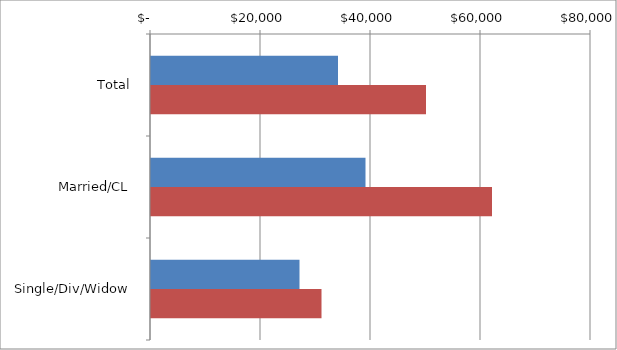
| Category | Series 0 | Series 1 |
|---|---|---|
| Total | 34000 | 50000 |
|  Married/CL  | 39000 | 62000 |
|  Single/Div/Widow  | 27000 | 31000 |